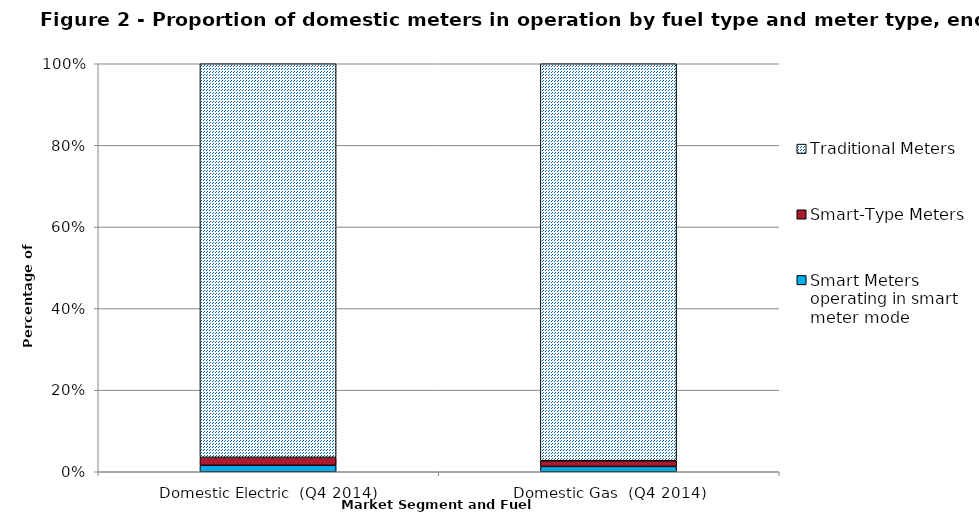
| Category | Smart Meters operating in smart meter mode | Smart-Type Meters | Traditional Meters |
|---|---|---|---|
| Domestic Electric  (Q4 2014) | 400645 | 491549 | 24398824 |
| Domestic Gas  (Q4 2014) | 270589 | 288354 | 20275894 |